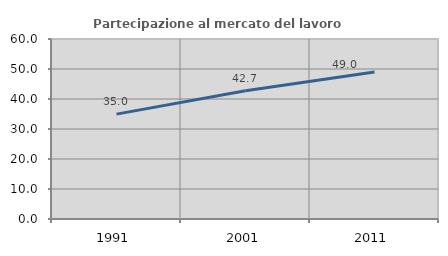
| Category | Partecipazione al mercato del lavoro  femminile |
|---|---|
| 1991.0 | 34.95 |
| 2001.0 | 42.718 |
| 2011.0 | 49.017 |